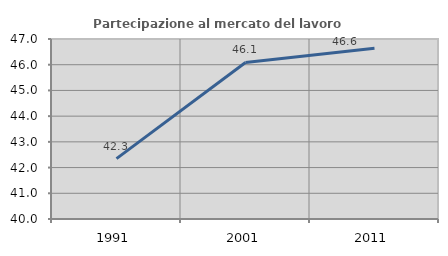
| Category | Partecipazione al mercato del lavoro  femminile |
|---|---|
| 1991.0 | 42.349 |
| 2001.0 | 46.087 |
| 2011.0 | 46.637 |